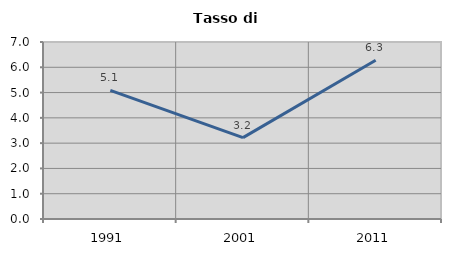
| Category | Tasso di disoccupazione   |
|---|---|
| 1991.0 | 5.084 |
| 2001.0 | 3.217 |
| 2011.0 | 6.279 |